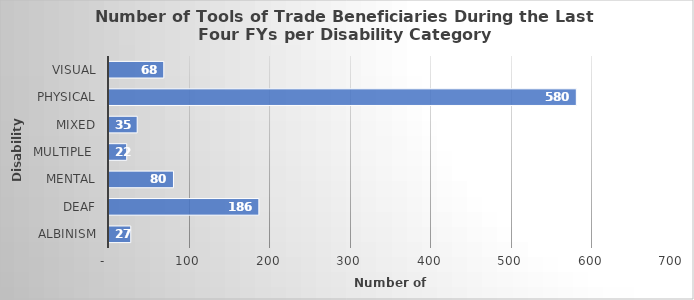
| Category | Total |
|---|---|
| ALBINISM | 27 |
| DEAF | 186 |
| MENTAL | 80 |
| MULTIPLE  | 22 |
| MIXED | 35 |
| PHYSICAL | 580 |
| VISUAL | 68 |